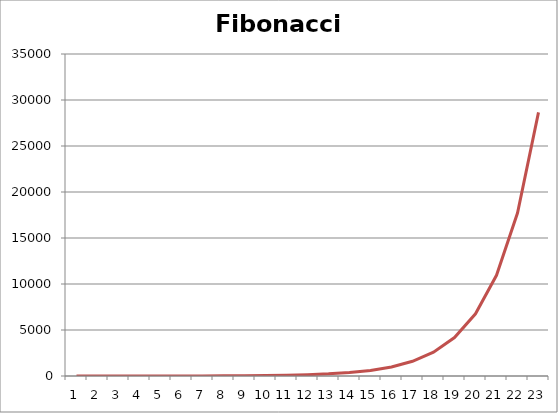
| Category | Fibonucci Numbers |
|---|---|
| 0 | 1 |
| 1 | 1 |
| 2 | 2 |
| 3 | 3 |
| 4 | 5 |
| 5 | 8 |
| 6 | 13 |
| 7 | 21 |
| 8 | 34 |
| 9 | 55 |
| 10 | 89 |
| 11 | 144 |
| 12 | 233 |
| 13 | 377 |
| 14 | 610 |
| 15 | 987 |
| 16 | 1597 |
| 17 | 2584 |
| 18 | 4181 |
| 19 | 6765 |
| 20 | 10946 |
| 21 | 17711 |
| 22 | 28657 |